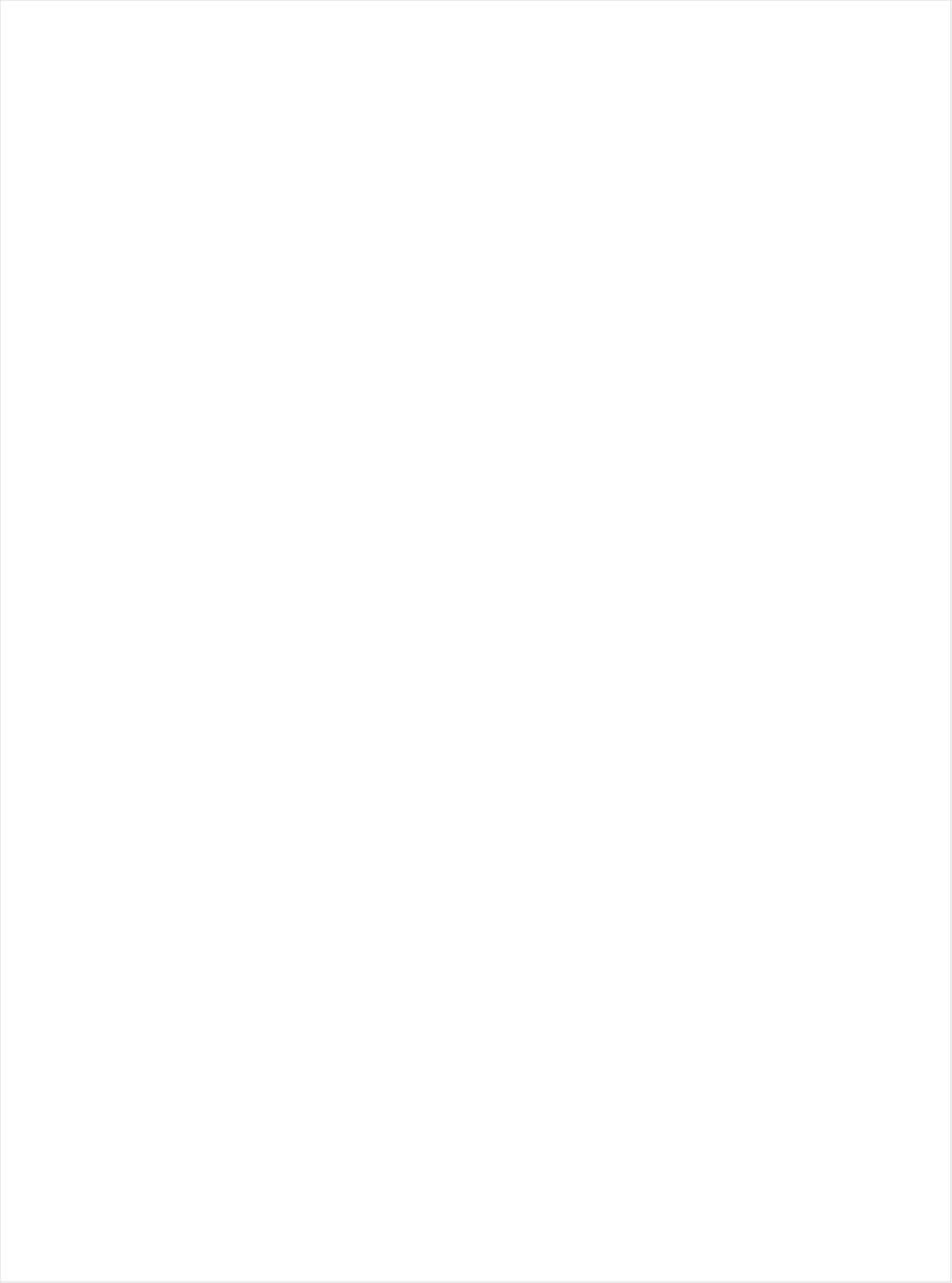
| Category | Total |
|---|---|
| Telemundo | -0.677 |
| UniMas | -0.667 |
| NBC Universo | -0.614 |
| Galavision | -0.607 |
| Univision | -0.572 |
| TUDN | -0.448 |
| Hallmark Movies & Mysteries | -0.262 |
| UP TV | -0.231 |
| Hallmark | -0.226 |
| Discovery Life Channel | -0.199 |
| Cartoon Network | -0.168 |
| Nick Toons | -0.163 |
| Lifetime Movies | -0.152 |
| Logo | -0.146 |
| TLC | -0.144 |
| Disney Channel | -0.128 |
| Disney XD | -0.126 |
| Travel | -0.116 |
| WE TV | -0.116 |
| Oprah Winfrey Network | -0.101 |
| INSP | -0.096 |
| Teen Nick | -0.09 |
| Adult Swim | -0.087 |
| Nick | -0.086 |
| Investigation Discovery | -0.086 |
| RFD TV | -0.085 |
| E! | -0.066 |
| Nick@Nite | -0.057 |
| OXYGEN | -0.051 |
| POP | -0.039 |
| CMTV | -0.025 |
| Nick Jr. | -0.02 |
| Lifetime | -0.02 |
| ION | -0.018 |
| Universal Kids | -0.006 |
| Great American Country | 0.002 |
| BRAVO | 0.004 |
| Disney Junior US | 0.004 |
| TV LAND | 0.005 |
| National Geographic Wild | 0.011 |
| CW | 0.012 |
| Discovery Family Channel | 0.014 |
| Science Channel | 0.015 |
| BET | 0.02 |
| VH1 | 0.026 |
| MSNBC | 0.028 |
| PBS | 0.031 |
| HGTV | 0.038 |
| Weather Channel | 0.039 |
| Ovation | 0.046 |
| BET Her | 0.048 |
| Animal Planet | 0.056 |
| Fox Business | 0.057 |
| Freeform | 0.06 |
| TV ONE | 0.062 |
| USA Network | 0.083 |
| FXX | 0.085 |
| WGN America | 0.085 |
| CBS | 0.087 |
| MTV2 | 0.088 |
| Fox News | 0.09 |
| SYFY | 0.091 |
| FX | 0.101 |
| Motor Trend Network | 0.102 |
| A&E | 0.107 |
| Bloomberg HD | 0.116 |
| MTV | 0.123 |
| FYI | 0.124 |
| CNN | 0.129 |
| BBC America | 0.134 |
| Discovery Channel | 0.136 |
| History Channel | 0.136 |
| FX Movie Channel | 0.138 |
| Food Network | 0.138 |
| NBC | 0.141 |
| DIY | 0.148 |
| ABC | 0.148 |
| SundanceTV | 0.15 |
| Paramount Network | 0.15 |
| Game Show | 0.152 |
| Smithsonian | 0.166 |
| Reelz Channel | 0.166 |
| American Heroes Channel | 0.171 |
| AMC | 0.194 |
| National Geographic | 0.195 |
| Destination America | 0.197 |
| Cooking Channel | 0.21 |
| CNBC | 0.21 |
| Independent Film (IFC) | 0.221 |
| FOX | 0.246 |
| Comedy Central | 0.261 |
| Outdoor Channel | 0.262 |
| Viceland | 0.318 |
| TBS | 0.351 |
| The Sportsman Channel | 0.353 |
| Tennis Channel | 0.367 |
| TNT | 0.384 |
| ESPN Deportes | 0.407 |
| FXDEP | 0.435 |
| Headline News | 0.45 |
| MyNetworkTV | 0.453 |
| Olympic Channel | 0.457 |
| FOX Sports 2 | 0.524 |
| PAC-12 Network | 0.547 |
| Fox Sports 1 | 0.558 |
| truTV | 0.573 |
| CBS Sports | 0.611 |
| NHL | 0.645 |
| Golf | 0.666 |
| NBC Sports | 0.688 |
| ESPN2 | 0.691 |
| MLB Network | 0.707 |
| ESPNEWS | 0.724 |
| Big Ten Network | 0.725 |
| NBA TV | 0.728 |
| ESPNU | 0.756 |
| ESPN | 0.77 |
| NFL Network | 1.03 |